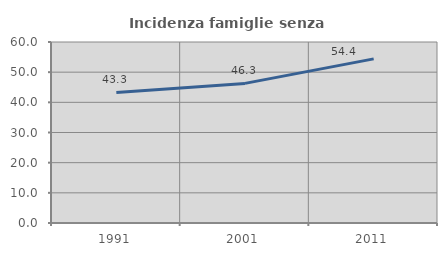
| Category | Incidenza famiglie senza nuclei |
|---|---|
| 1991.0 | 43.295 |
| 2001.0 | 46.278 |
| 2011.0 | 54.409 |